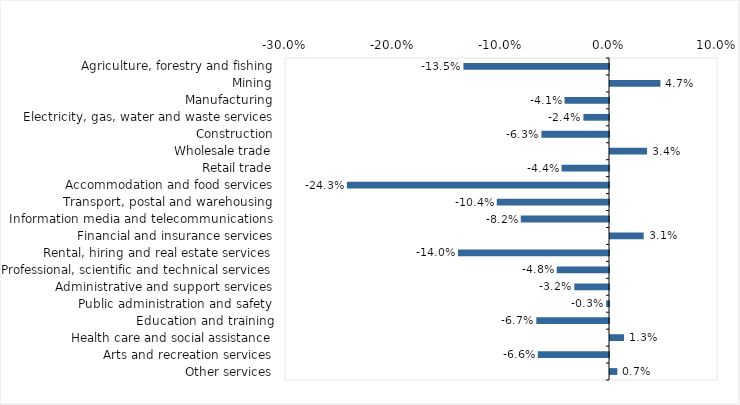
| Category | This week |
|---|---|
| Agriculture, forestry and fishing | -0.135 |
| Mining | 0.047 |
| Manufacturing | -0.041 |
| Electricity, gas, water and waste services | -0.024 |
| Construction | -0.063 |
| Wholesale trade | 0.034 |
| Retail trade | -0.044 |
| Accommodation and food services | -0.243 |
| Transport, postal and warehousing | -0.104 |
| Information media and telecommunications | -0.082 |
| Financial and insurance services | 0.031 |
| Rental, hiring and real estate services | -0.14 |
| Professional, scientific and technical services | -0.048 |
| Administrative and support services | -0.032 |
| Public administration and safety | -0.003 |
| Education and training | -0.067 |
| Health care and social assistance | 0.013 |
| Arts and recreation services | -0.066 |
| Other services | 0.007 |